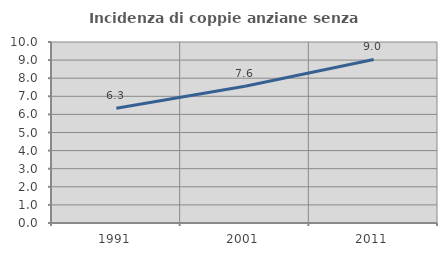
| Category | Incidenza di coppie anziane senza figli  |
|---|---|
| 1991.0 | 6.337 |
| 2001.0 | 7.559 |
| 2011.0 | 9.035 |